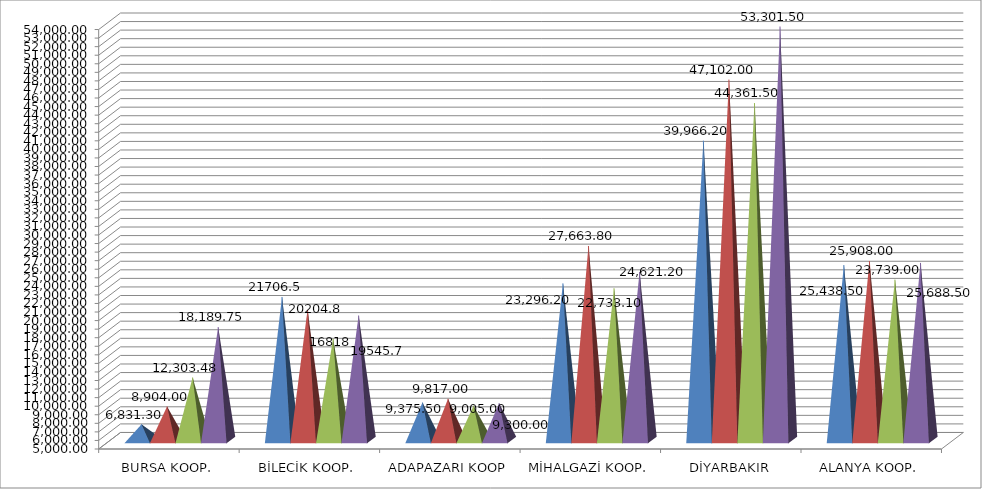
| Category | 2008 | 2009 | 2010 | 2011 |
|---|---|---|---|---|
| BURSA KOOP. | 6831.3 | 8904 | 12303.48 | 18189.75 |
| BİLECİK KOOP. | 21706.5 | 20204.8 | 16818 | 19545.7 |
| ADAPAZARI KOOP | 9375.5 | 9817 | 9005 | 9300 |
| MİHALGAZİ KOOP. | 23296.2 | 27663.8 | 22733.1 | 24621.2 |
| DİYARBAKIR | 39966.2 | 47102 | 44361.5 | 53301.5 |
| ALANYA KOOP. | 25438.5 | 25908 | 23739 | 25688.5 |